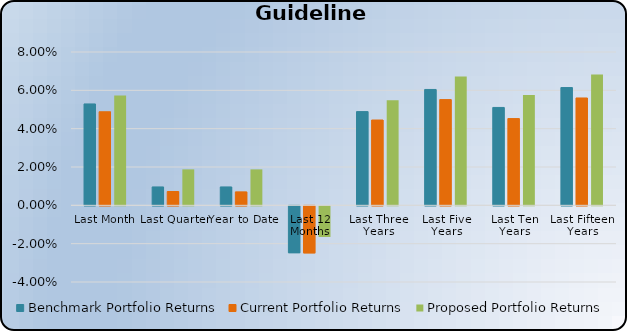
| Category | Benchmark Portfolio Returns | Current Portfolio Returns | Proposed Portfolio Returns |
|---|---|---|---|
| Last Month | 0.053 | 0.049 | 0.057 |
| Last Quarter | 0.01 | 0.007 | 0.019 |
| Year to Date | 0.01 | 0.007 | 0.019 |
| Last 12 Months | -0.024 | -0.025 | -0.016 |
| Last Three Years | 0.049 | 0.045 | 0.055 |
| Last Five Years | 0.06 | 0.055 | 0.067 |
| Last Ten Years | 0.051 | 0.045 | 0.058 |
| Last Fifteen Years | 0.061 | 0.056 | 0.068 |